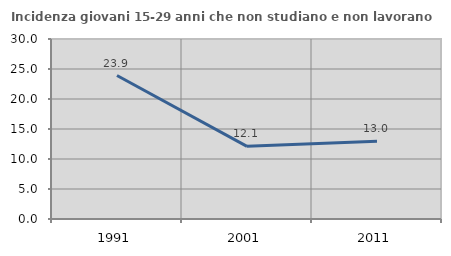
| Category | Incidenza giovani 15-29 anni che non studiano e non lavorano  |
|---|---|
| 1991.0 | 23.913 |
| 2001.0 | 12.112 |
| 2011.0 | 12.957 |